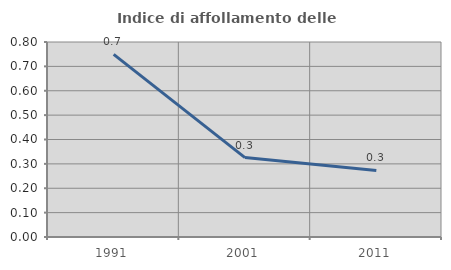
| Category | Indice di affollamento delle abitazioni  |
|---|---|
| 1991.0 | 0.749 |
| 2001.0 | 0.326 |
| 2011.0 | 0.273 |